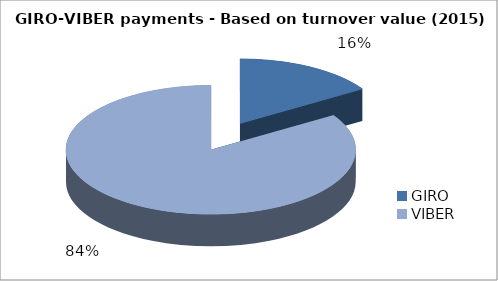
| Category | Forgalmi érték alapján 2015-ben |
|---|---|
| GIRO | 0.16 |
| VIBER | 0.84 |